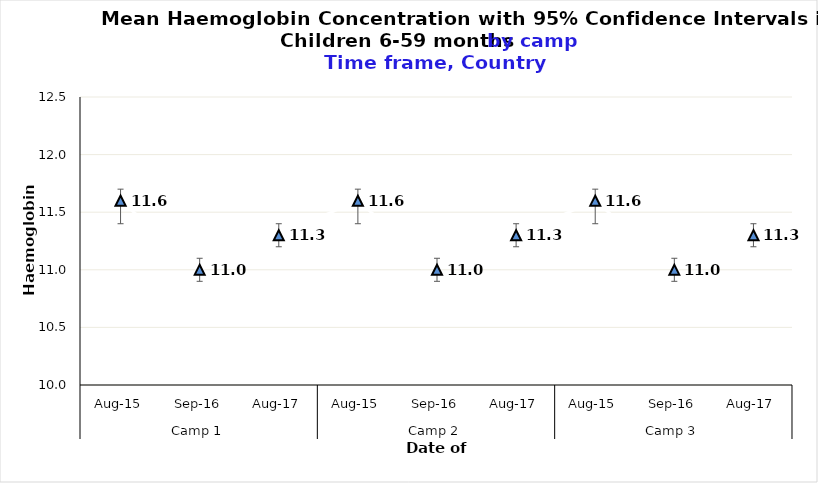
| Category | Mean HB |
|---|---|
| 0 | 11.6 |
| 1 | 11 |
| 2 | 11.3 |
| 3 | 11.6 |
| 4 | 11 |
| 5 | 11.3 |
| 6 | 11.6 |
| 7 | 11 |
| 8 | 11.3 |